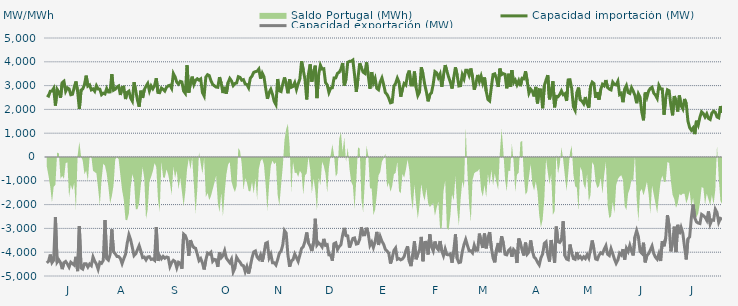
| Category | Capacidad importación (MW) | Capacidad exportación (MW) |
|---|---|---|
| 0 | 2602.5 | -4453.125 |
| 1900-01-01 | 2561.25 | -4380 |
| 1900-01-02 | 2763.75 | -4098.75 |
| 1900-01-03 | 2769.375 | -4436.25 |
| 1900-01-04 | 2887.5 | -4333.125 |
| 1900-01-05 | 2159.625 | -2520.833 |
| 1900-01-06 | 2846.25 | -4423.125 |
| 1900-01-07 | 2730 | -4323.75 |
| 1900-01-08 | 2491.875 | -4438.125 |
| 1900-01-09 | 3123.75 | -4711.875 |
| 1900-01-10 | 3183.75 | -4440 |
| 1900-01-11 | 2761.875 | -4387.5 |
| 1900-01-12 | 2908.125 | -4496.25 |
| 1900-01-13 | 2861.25 | -4627.5 |
| 1900-01-14 | 2615.625 | -4421.25 |
| 1900-01-15 | 2636.25 | -4479.375 |
| 1900-01-16 | 2925 | -4541.25 |
| 1900-01-17 | 3172.917 | -4194.583 |
| 1900-01-18 | 2752.5 | -4794.375 |
| 1900-01-19 | 2024.208 | -2912.083 |
| 1900-01-20 | 2810.625 | -4661.25 |
| 1900-01-21 | 2859.375 | -4710 |
| 1900-01-22 | 3043.125 | -4486.875 |
| 1900-01-23 | 3418.125 | -4485 |
| 1900-01-24 | 2977.5 | -4623.75 |
| 1900-01-25 | 3028.125 | -4498.125 |
| 1900-01-26 | 2820 | -4565.625 |
| 1900-01-27 | 2863.125 | -4200 |
| 1900-01-28 | 2761.875 | -4381.875 |
| 1900-01-29 | 2994.375 | -4500 |
| 1900-01-30 | 2857.5 | -4715.625 |
| 1900-01-31 | 2850 | -4423.125 |
| 1900-02-01 | 2617.5 | -4466.25 |
| 1900-02-02 | 2681.25 | -4346.25 |
| 1900-02-03 | 2650 | -2650 |
| 1900-02-04 | 2876.25 | -4267.5 |
| 1900-02-05 | 2733.333 | -4333.125 |
| 1900-02-06 | 2735.625 | -4098.75 |
| 1900-02-07 | 3479.167 | -3041.667 |
| 1900-02-08 | 2805 | -3984.375 |
| 1900-02-09 | 2846.25 | -4065 |
| 1900-02-10 | 2941.875 | -4177.5 |
| 1900-02-11 | 2985 | -4183.125 |
| 1900-02-12 | 2606.25 | -4265.625 |
| 1900-02-13 | 2921.25 | -4481.25 |
| 1900-02-14 | 2938.125 | -4273.125 |
| 1900-02-15 | 2435 | -4091.25 |
| 1900-02-16 | 2716.875 | -3618.75 |
| 1900-02-17 | 2767.5 | -3264.375 |
| 1900-02-18 | 2476.875 | -3474.375 |
| 1900-02-19 | 2349.375 | -3798.75 |
| 1900-02-20 | 3142.5 | -4141.875 |
| 1900-02-21 | 2773.125 | -4066.875 |
| 1900-02-22 | 2390.625 | -3896.25 |
| 1900-02-23 | 2113.125 | -3723.75 |
| 1900-02-24 | 2786.25 | -3954.375 |
| 1900-02-25 | 2480.625 | -4226.25 |
| 1900-02-26 | 2829.375 | -4203.75 |
| 1900-02-27 | 2973.75 | -4323.75 |
| 1900-02-28 | 3090 | -4200 |
| 1900-02-28 | 2778.75 | -4186.875 |
| 1900-03-01 | 2986.875 | -4305 |
| 1900-03-02 | 2868.75 | -4282.5 |
| 1900-03-03 | 3000 | -4340.625 |
| 1900-03-04 | 3307.5 | -2947.5 |
| 1900-03-05 | 2713.125 | -4359.375 |
| 1900-03-06 | 2701.875 | -4158.75 |
| 1900-03-07 | 2896.875 | -4276.875 |
| 1900-03-08 | 2842.5 | -4177.5 |
| 1900-03-09 | 2773.125 | -4254.375 |
| 1900-03-10 | 2930.625 | -4201.875 |
| 1900-03-11 | 2990.625 | -4224.375 |
| 1900-03-12 | 3015 | -4603.125 |
| 1900-03-13 | 2883.75 | -4436.25 |
| 1900-03-14 | 3506.25 | -4342.5 |
| 1900-03-15 | 3367.5 | -4393.125 |
| 1900-03-16 | 3144.375 | -4653.75 |
| 1900-03-17 | 3063.75 | -4419.375 |
| 1900-03-18 | 3178.125 | -4456.875 |
| 1900-03-19 | 3153.75 | -4695 |
| 1900-03-20 | 2768.542 | -3240.125 |
| 1900-03-21 | 2672.083 | -3304.625 |
| 1900-03-22 | 3855 | -3498.75 |
| 1900-03-23 | 2703.125 | -4151.25 |
| 1900-03-24 | 3123.333 | -3495.125 |
| 1900-03-25 | 3376.875 | -3697.5 |
| 1900-03-26 | 3048.75 | -3805.875 |
| 1900-03-27 | 3225 | -3836.25 |
| 1900-03-28 | 3286.875 | -4085.625 |
| 1900-03-29 | 3230.625 | -4353.75 |
| 1900-03-30 | 3279.375 | -4267.5 |
| 1900-03-31 | 2704.917 | -4449.375 |
| 1900-04-01 | 2563.833 | -4725 |
| 1900-04-02 | 3360 | -4325.625 |
| 1900-04-03 | 3457.5 | -4035 |
| 1900-04-04 | 3420 | -4078.125 |
| 1900-04-05 | 3202.5 | -4005 |
| 1900-04-06 | 3050.625 | -4383.75 |
| 1900-04-07 | 2992.5 | -4301.25 |
| 1900-04-08 | 2938.125 | -4320 |
| 1900-04-09 | 2928.75 | -4614.375 |
| 1900-04-10 | 3356.25 | -4010.625 |
| 1900-04-11 | 3093.75 | -4231.875 |
| 1900-04-12 | 2686.875 | -4143.75 |
| 1900-04-13 | 2947.5 | -3935.625 |
| 1900-04-14 | 2664.375 | -4254.375 |
| 1900-04-15 | 3127.5 | -4350 |
| 1900-04-16 | 3300 | -4443.75 |
| 1900-04-17 | 3198.542 | -4296 |
| 1900-04-18 | 3001.875 | -4828.125 |
| 1900-04-19 | 3088.125 | -4666.875 |
| 1900-04-20 | 3110.625 | -4215 |
| 1900-04-21 | 3373.125 | -4336.875 |
| 1900-04-22 | 3345 | -4417.5 |
| 1900-04-23 | 3226.875 | -4541.25 |
| 1900-04-24 | 3251.25 | -4569.375 |
| 1900-04-25 | 3069.375 | -4816.875 |
| 1900-04-26 | 3046.875 | -4610.625 |
| 1900-04-27 | 2910 | -4897.5 |
| 1900-04-28 | 3309.375 | -4593.75 |
| 1900-04-29 | 3399.792 | -4243 |
| 1900-04-30 | 3556.875 | -3988.125 |
| 1900-05-01 | 3585.6 | -3948.08 |
| 1900-05-02 | 3605.625 | -4208.542 |
| 1900-05-03 | 3697.5 | -4290 |
| 1900-05-04 | 3291.25 | -4115.625 |
| 1900-05-05 | 3523.125 | -4398.75 |
| 1900-05-06 | 3371.25 | -4055.625 |
| 1900-05-07 | 2883.75 | -3628.125 |
| 1900-05-08 | 2445 | -3590.625 |
| 1900-05-09 | 2711.25 | -4233.75 |
| 1900-05-10 | 2842.292 | -4080 |
| 1900-05-11 | 2631.042 | -4443.75 |
| 1900-05-12 | 2333.542 | -4443.75 |
| 1900-05-13 | 2201.25 | -4537.5 |
| 1900-05-14 | 3275.625 | -4314.375 |
| 1900-05-15 | 2778.75 | -4038.75 |
| 1900-05-16 | 2749.167 | -3955 |
| 1900-05-17 | 3064.375 | -3696.875 |
| 1900-05-18 | 3341.083 | -3091.583 |
| 1900-05-19 | 3070.042 | -3200 |
| 1900-05-20 | 2678.625 | -4117.917 |
| 1900-05-21 | 3264.375 | -4610.625 |
| 1900-05-22 | 2928.75 | -4363.125 |
| 1900-05-23 | 2966.25 | -4316.25 |
| 1900-05-24 | 3121.875 | -4074.375 |
| 1900-05-25 | 2836.875 | -4230 |
| 1900-05-26 | 3078.75 | -4385.625 |
| 1900-05-27 | 3281.25 | -4121.25 |
| 1900-05-28 | 4027.5 | -3836.25 |
| 1900-05-29 | 3646.875 | -3765 |
| 1900-05-30 | 3256.875 | -3536.25 |
| 1900-05-31 | 2419.833 | -3170.625 |
| 1900-06-01 | 3472.5 | -3611.25 |
| 1900-06-02 | 3890.625 | -3742.5 |
| 1900-06-03 | 3166.875 | -3954.375 |
| 1900-06-04 | 3577.5 | -3583.125 |
| 1900-06-05 | 3836 | -2595.625 |
| 1900-06-06 | 2475 | -3700 |
| 1900-06-07 | 3466.875 | -3605.625 |
| 1900-06-08 | 3856.875 | -3676.458 |
| 1900-06-09 | 3697.5 | -3778.125 |
| 1900-06-10 | 3708.75 | -3440.625 |
| 1900-06-11 | 3125.625 | -3712.5 |
| 1900-06-12 | 3026.792 | -3685.625 |
| 1900-06-13 | 2711.458 | -4111.875 |
| 1900-06-14 | 2894.583 | -4117.5 |
| 1900-06-15 | 2908.583 | -4353.75 |
| 1900-06-16 | 3321.875 | -3639.375 |
| 1900-06-17 | 3324.375 | -3603.75 |
| 1900-06-18 | 3515.833 | -3886.875 |
| 1900-06-19 | 3562.5 | -3763.125 |
| 1900-06-20 | 3684.792 | -3688.125 |
| 1900-06-21 | 3950.625 | -3281.25 |
| 1900-06-22 | 3006.042 | -2979.375 |
| 1900-06-23 | 3276.667 | -3305.625 |
| 1900-06-24 | 3978.75 | -3315 |
| 1900-06-25 | 4018.125 | -3806.25 |
| 1900-06-26 | 4020 | -3611.25 |
| 1900-06-27 | 4072.5 | -3421.458 |
| 1900-06-28 | 3435 | -3400.208 |
| 1900-06-29 | 2733.458 | -3658.125 |
| 1900-06-30 | 3328.542 | -3637.5 |
| 1900-07-01 | 3937.5 | -3451.875 |
| 1900-07-02 | 3746.25 | -2948.958 |
| 1900-07-03 | 3564.375 | -3273.75 |
| 1900-07-04 | 3513.75 | -3266.25 |
| 1900-07-05 | 3975 | -2973.75 |
| 1900-07-06 | 3418.125 | -3228.75 |
| 1900-07-07 | 2868.75 | -3712.5 |
| 1900-07-08 | 3568.125 | -3577.5 |
| 1900-07-09 | 3120 | -3802.5 |
| 1900-07-10 | 3305.625 | -3564.375 |
| 1900-07-11 | 2884.375 | -3145.875 |
| 1900-07-12 | 2826.25 | -3695.625 |
| 1900-07-13 | 3149.792 | -3346.875 |
| 1900-07-14 | 3321.458 | -3540 |
| 1900-07-15 | 3048.75 | -3665.625 |
| 1900-07-16 | 2704.25 | -3881.25 |
| 1900-07-17 | 2627.25 | -3950.625 |
| 1900-07-18 | 2475.708 | -4038.75 |
| 1900-07-19 | 2277.917 | -4477.5 |
| 1900-07-20 | 2300 | -4239.375 |
| 1900-07-21 | 2972.708 | -3928.125 |
| 1900-07-22 | 3093.75 | -3825 |
| 1900-07-23 | 3313.333 | -4297.5 |
| 1900-07-24 | 3141.75 | -4268.125 |
| 1900-07-25 | 2533.125 | -4321.875 |
| 1900-07-26 | 2863.375 | -4282.5 |
| 1900-07-27 | 3088.125 | -4185 |
| 1900-07-28 | 3024.375 | -3931.875 |
| 1900-07-29 | 3459.375 | -3751.875 |
| 1900-07-30 | 3630 | -4380 |
| 1900-07-31 | 3020.625 | -4586.25 |
| 1900-08-01 | 3020.625 | -4091.25 |
| 1900-08-02 | 3592.5 | -3540 |
| 1900-08-03 | 2925 | -4297.5 |
| 1900-08-04 | 2582.625 | -4080.542 |
| 1900-08-05 | 2730 | -3900.625 |
| 1900-08-06 | 3769.167 | -3357.25 |
| 1900-08-07 | 3498.625 | -4380 |
| 1900-08-08 | 3058.125 | -3591.583 |
| 1900-08-09 | 2735.625 | -3581.875 |
| 1900-08-10 | 2339.792 | -4096.875 |
| 1900-08-11 | 2622.625 | -3250.667 |
| 1900-08-12 | 2697.5 | -3770.625 |
| 1900-08-13 | 3064.167 | -3943.625 |
| 1900-08-14 | 3588.75 | -3549.375 |
| 1900-08-15 | 3535.75 | -3810 |
| 1900-08-16 | 3333.958 | -3898.125 |
| 1900-08-17 | 3486.625 | -3530.542 |
| 1900-08-18 | 2951.375 | -3943.125 |
| 1900-08-19 | 3439.375 | -4149.375 |
| 1900-08-20 | 3860.625 | -3864.375 |
| 1900-08-21 | 3609.583 | -4100.625 |
| 1900-08-22 | 3359.75 | -4110 |
| 1900-08-23 | 3152.25 | -4073.75 |
| 1900-08-24 | 2876.25 | -4441.875 |
| 1900-08-25 | 3331.25 | -3948.75 |
| 1900-08-26 | 3768.75 | -3251.25 |
| 1900-08-27 | 3435.667 | -4269.375 |
| 1900-08-28 | 2984.167 | -4438.125 |
| 1900-08-29 | 2998.583 | -4415.625 |
| 1900-08-30 | 3457.333 | -3980.625 |
| 1900-08-31 | 3283.042 | -3676.875 |
| 1900-09-01 | 3641.25 | -3464.5 |
| 1900-09-02 | 3640.708 | -3708.75 |
| 1900-09-03 | 3435.708 | -3937.5 |
| 1900-09-04 | 3718.125 | -3943.125 |
| 1900-09-05 | 3344.458 | -4031.25 |
| 1900-09-06 | 2827.083 | -3710.625 |
| 1900-09-07 | 3113.75 | -3920.625 |
| 1900-09-08 | 3448.125 | -3913.125 |
| 1900-09-09 | 3172.083 | -3219.375 |
| 1900-09-10 | 3397.5 | -3562.5 |
| 1900-09-11 | 3101.042 | -3819.375 |
| 1900-09-12 | 3341.25 | -3215.625 |
| 1900-09-13 | 2760.833 | -3838.125 |
| 1900-09-14 | 2417.5 | -3395.625 |
| 1900-09-15 | 2354.583 | -3155.625 |
| 1900-09-16 | 2936.875 | -3811.875 |
| 1900-09-17 | 3468.75 | -4241.25 |
| 1900-09-18 | 3495 | -4426.875 |
| 1900-09-19 | 3297.083 | -3890.625 |
| 1900-09-20 | 2946.292 | -3613.125 |
| 1900-09-21 | 3714.792 | -3997.5 |
| 1900-09-22 | 3460.833 | -3331.875 |
| 1900-09-23 | 3502.917 | -3618.5 |
| 1900-09-24 | 3472.5 | -4089.375 |
| 1900-09-25 | 2885.87 | -4111.304 |
| 1900-09-26 | 3496.875 | -3930 |
| 1900-09-27 | 2942.5 | -3858.75 |
| 1900-09-28 | 3650.625 | -4194.375 |
| 1900-09-29 | 3122.458 | -3885 |
| 1900-09-30 | 3230.042 | -3961.875 |
| 1900-10-01 | 3034.208 | -4453.125 |
| 1900-10-02 | 3206.25 | -3423.75 |
| 1900-10-03 | 2977.5 | -3611.25 |
| 1900-10-04 | 3309.375 | -3911.25 |
| 1900-10-05 | 3288.75 | -4138.125 |
| 1900-10-06 | 3602.833 | -3596.25 |
| 1900-10-07 | 3174.375 | -4080 |
| 1900-10-08 | 2683.667 | -3991.875 |
| 1900-10-09 | 2848.875 | -3504.833 |
| 1900-10-10 | 2758.542 | -3938.333 |
| 1900-10-11 | 2545.417 | -4209.375 |
| 1900-10-12 | 2945.625 | -4278.75 |
| 1900-10-13 | 2252.5 | -4423.125 |
| 1900-10-14 | 2829.375 | -4533.75 |
| 1900-10-15 | 2820.917 | -4235.625 |
| 1900-10-16 | 2048.125 | -4081.208 |
| 1900-10-17 | 3003.75 | -3632.292 |
| 1900-10-18 | 3232.5 | -3565.625 |
| 1900-10-19 | 3440.625 | -4096.875 |
| 1900-10-20 | 2422.5 | -4393.125 |
| 1900-10-21 | 2763.958 | -3487.5 |
| 1900-10-22 | 3183.75 | -3943.125 |
| 1900-10-23 | 2087.083 | -4443.75 |
| 1900-10-24 | 2547 | -2925.75 |
| 1900-10-25 | 2531.667 | -3560.625 |
| 1900-10-26 | 2628.75 | -3590.625 |
| 1900-10-27 | 2778.75 | -3480 |
| 1900-10-28 | 2617.292 | -2701.792 |
| 1900-10-29 | 2655 | -4141.875 |
| 1900-10-30 | 2355.417 | -4288.125 |
| 1900-10-31 | 3240.75 | -4318.125 |
| 1900-11-01 | 3247.5 | -3676.875 |
| 1900-11-02 | 2878.042 | -4025.625 |
| 1900-11-03 | 2109.167 | -4269.375 |
| 1900-11-04 | 1961.042 | -4299.375 |
| 1900-11-05 | 2710.208 | -4003.125 |
| 1900-11-06 | 2916 | -4248.333 |
| 1900-11-07 | 2401.875 | -4179.375 |
| 1900-11-08 | 2351.25 | -4286.25 |
| 1900-11-09 | 2238.75 | -4192.5 |
| 1900-11-10 | 2520 | -4265.625 |
| 1900-11-11 | 2227.5 | -4108.125 |
| 1900-11-12 | 2070.583 | -4246.875 |
| 1900-11-13 | 2958.75 | -3892.5 |
| 1900-11-14 | 3146.25 | -3508.125 |
| 1900-11-15 | 3087.5 | -3877.5 |
| 1900-11-16 | 2487.5 | -4284.375 |
| 1900-11-17 | 2722.5 | -4310.625 |
| 1900-11-18 | 2411.25 | -4125 |
| 1900-11-19 | 2840.5 | -4025.625 |
| 1900-11-20 | 3054.5 | -4066.875 |
| 1900-11-21 | 2992.958 | -3879.375 |
| 1900-11-22 | 3232.5 | -3729.375 |
| 1900-11-23 | 2917.5 | -4085.625 |
| 1900-11-24 | 2853.75 | -4141.875 |
| 1900-11-25 | 2819.458 | -3849.375 |
| 1900-11-26 | 3145.042 | -4061.25 |
| 1900-11-27 | 3046.958 | -4290 |
| 1900-11-28 | 3028.125 | -4468.125 |
| 1900-11-29 | 3180.542 | -4331.25 |
| 1900-11-30 | 2624.958 | -4042.5 |
| 1900-12-01 | 2676.25 | -4115.625 |
| 1900-12-02 | 2302.5 | -3873.75 |
| 1900-12-03 | 2854.208 | -4308.75 |
| 1900-12-04 | 2997.833 | -3837.167 |
| 1900-12-05 | 2709.375 | -3973.125 |
| 1900-12-06 | 2670 | -3712.958 |
| 1900-12-07 | 2913.75 | -3958.125 |
| 1900-12-08 | 2765.625 | -4134.375 |
| 1900-12-09 | 2587.5 | -3352.5 |
| 1900-12-10 | 2261.25 | -3093.75 |
| 1900-12-11 | 2651.25 | -3345.208 |
| 1900-12-12 | 2510.625 | -3963.75 |
| 1900-12-13 | 1885.875 | -4044.375 |
| 1900-12-14 | 1541.5 | -3601.375 |
| 1900-12-15 | 2707.5 | -4426.875 |
| 1900-12-16 | 2516.25 | -4128.75 |
| 1900-12-17 | 2775 | -4059.375 |
| 1900-12-18 | 2883.75 | -3906.667 |
| 1900-12-19 | 2930.625 | -3742.5 |
| 1900-12-20 | 2685 | -4061.25 |
| 1900-12-21 | 2596.875 | -4213.125 |
| 1900-12-22 | 2463.75 | -4295.625 |
| 1900-12-23 | 3005.625 | -4065 |
| 1900-12-24 | 2861.25 | -4370.625 |
| 1900-12-25 | 2855.083 | -3533.583 |
| 1900-12-26 | 1775.625 | -3751.875 |
| 1900-12-27 | 2478.75 | -3391.875 |
| 1900-12-28 | 2821.875 | -2444.375 |
| 1900-12-29 | 2782.5 | -2903.75 |
| 1900-12-30 | 2169.375 | -3964.667 |
| 1900-12-31 | 1751.292 | -3614.625 |
| 1901-01-01 | 2561.25 | -2926.875 |
| 1901-01-02 | 2356.875 | -3995.625 |
| 1901-01-03 | 1911.125 | -2849.625 |
| 1901-01-04 | 2583.75 | -3240 |
| 1901-01-05 | 2157.125 | -2962.917 |
| 1901-01-06 | 2021.375 | -3195.625 |
| 1901-01-07 | 2439.375 | -3776.25 |
| 1901-01-08 | 2235 | -4305 |
| 1901-01-09 | 1509.375 | -3436.875 |
| 1901-01-10 | 1230.208 | -3360 |
| 1901-01-11 | 1123.125 | -2546.875 |
| 1901-01-12 | 1221.25 | -1995.875 |
| 1901-01-13 | 962.083 | -2563.125 |
| 1901-01-14 | 1523.958 | -2728.125 |
| 1901-01-15 | 1344.375 | -2776.875 |
| 1901-01-16 | 1676.25 | -2795.625 |
| 1901-01-17 | 1899.375 | -2411.25 |
| 1901-01-18 | 1826.25 | -2461.875 |
| 1901-01-19 | 1680 | -2529.375 |
| 1901-01-20 | 1815 | -2662.5 |
| 1901-01-21 | 1621.458 | -2287.5 |
| 1901-01-22 | 1577.083 | -2818.125 |
| 1901-01-23 | 1846.875 | -2643.75 |
| 1901-01-24 | 1923.75 | -2656.875 |
| 1901-01-25 | 1875 | -2195.625 |
| 1901-01-26 | 1683.75 | -2330.625 |
| 1901-01-27 | 1646.25 | -2746.875 |
| 1901-01-28 | 2137.5 | -2580.5 |
| 1901-01-29 | 1860 | -2620.625 |